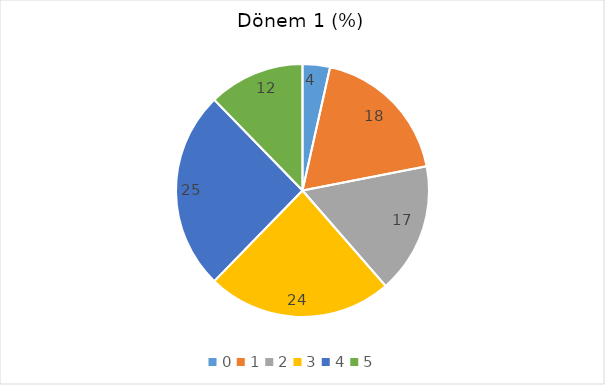
| Category | Dönem 1 (%) |
|---|---|
| 0.0 | 3.509 |
| 1.0 | 18.421 |
| 2.0 | 16.667 |
| 3.0 | 23.684 |
| 4.0 | 25.439 |
| 5.0 | 12.281 |